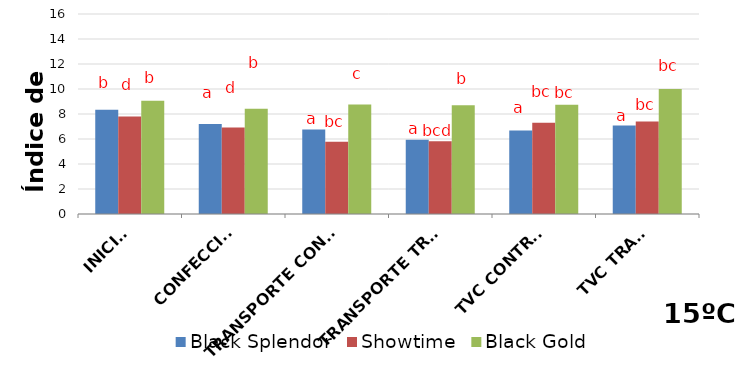
| Category | Black Splendor | Showtime | Black Gold |
|---|---|---|---|
| INICIAL | 8.341 | 7.808 | 9.065 |
| CONFECCIÓN | 7.198 | 6.921 | 8.421 |
| TRANSPORTE CONTROL | 6.767 | 5.783 | 8.764 |
| TRANSPORTE TRAT. | 5.946 | 5.814 | 8.706 |
| TVC CONTROL | 6.678 | 7.304 | 8.744 |
| TVC TRAT. | 7.073 | 7.391 | 10.008 |